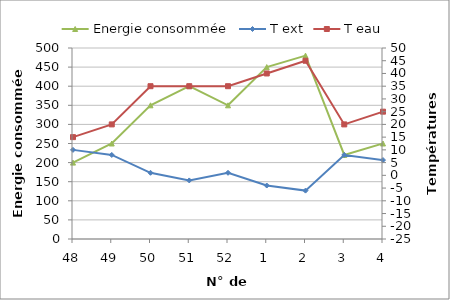
| Category | Energie consommée |
|---|---|
| 48.0 | 200 |
| 49.0 | 250 |
| 50.0 | 350 |
| 51.0 | 400 |
| 52.0 | 350 |
| 1.0 | 450 |
| 2.0 | 480 |
| 3.0 | 220 |
| 4.0 | 250 |